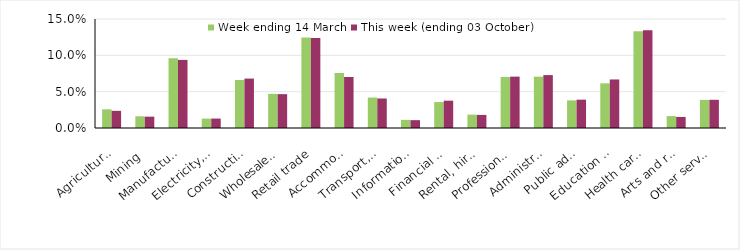
| Category | Week ending 14 March | This week (ending 03 October) |
|---|---|---|
| Agriculture, forestry and fishing | 0.026 | 0.024 |
| Mining | 0.016 | 0.016 |
| Manufacturing | 0.096 | 0.094 |
| Electricity, gas, water and waste services | 0.013 | 0.013 |
| Construction | 0.066 | 0.068 |
| Wholesale trade | 0.047 | 0.047 |
| Retail trade | 0.124 | 0.124 |
| Accommodation and food services | 0.076 | 0.07 |
| Transport, postal and warehousing | 0.042 | 0.041 |
| Information media and telecommunications | 0.011 | 0.011 |
| Financial and insurance services | 0.036 | 0.038 |
| Rental, hiring and real estate services | 0.018 | 0.018 |
| Professional, scientific and technical services | 0.07 | 0.071 |
| Administrative and support services | 0.071 | 0.073 |
| Public administration and safety | 0.038 | 0.039 |
| Education and training | 0.062 | 0.067 |
| Health care and social assistance | 0.133 | 0.134 |
| Arts and recreation services | 0.016 | 0.015 |
| Other services | 0.039 | 0.039 |